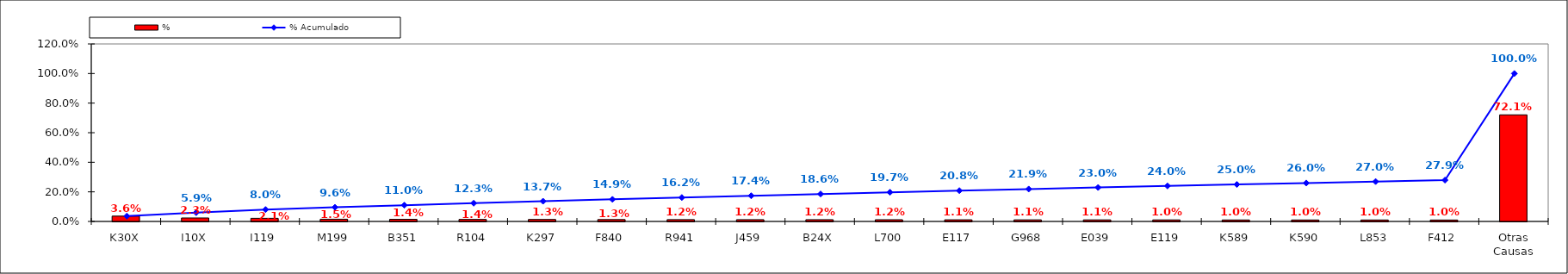
| Category | % |
|---|---|
| K30X | 0.036 |
| I10X | 0.023 |
| I119 | 0.021 |
| M199 | 0.015 |
| B351 | 0.014 |
| R104 | 0.014 |
| K297 | 0.013 |
| F840 | 0.013 |
| R941 | 0.012 |
| J459 | 0.012 |
| B24X | 0.012 |
| L700 | 0.012 |
| E117 | 0.011 |
| G968 | 0.011 |
| E039 | 0.011 |
| E119 | 0.01 |
| K589 | 0.01 |
| K590 | 0.01 |
| L853 | 0.01 |
| F412 | 0.01 |
| Otras Causas | 0.721 |